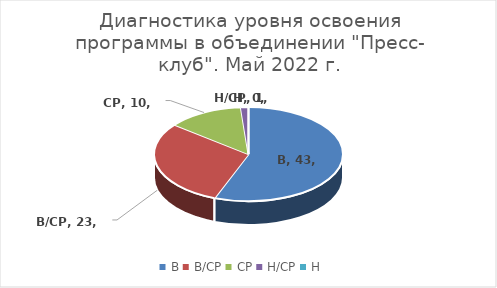
| Category | Series 0 |
|---|---|
| В | 43 |
| В/СР | 23 |
| СР | 10 |
| Н/СР | 1 |
| Н | 0 |